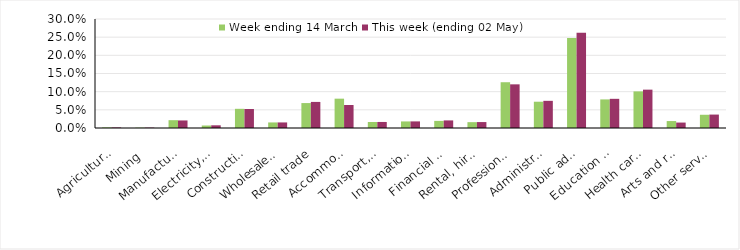
| Category | Week ending 14 March | This week (ending 02 May) |
|---|---|---|
| Agriculture, forestry and fishing | 0.002 | 0.002 |
| Mining | 0.001 | 0.001 |
| Manufacturing | 0.021 | 0.021 |
| Electricity, gas, water and waste services | 0.007 | 0.007 |
| Construction | 0.053 | 0.052 |
| Wholesale trade | 0.015 | 0.015 |
| Retail trade | 0.069 | 0.072 |
| Accommodation and food services | 0.081 | 0.063 |
| Transport, postal and warehousing | 0.017 | 0.017 |
| Information media and telecommunications | 0.018 | 0.018 |
| Financial and insurance services | 0.02 | 0.021 |
| Rental, hiring and real estate services | 0.016 | 0.016 |
| Professional, scientific and technical services | 0.126 | 0.12 |
| Administrative and support services | 0.072 | 0.075 |
| Public administration and safety | 0.248 | 0.262 |
| Education and training | 0.079 | 0.08 |
| Health care and social assistance | 0.101 | 0.106 |
| Arts and recreation services | 0.019 | 0.015 |
| Other services | 0.036 | 0.037 |